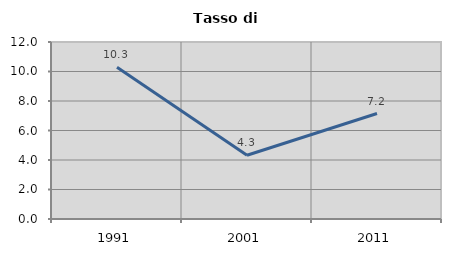
| Category | Tasso di disoccupazione   |
|---|---|
| 1991.0 | 10.285 |
| 2001.0 | 4.325 |
| 2011.0 | 7.151 |